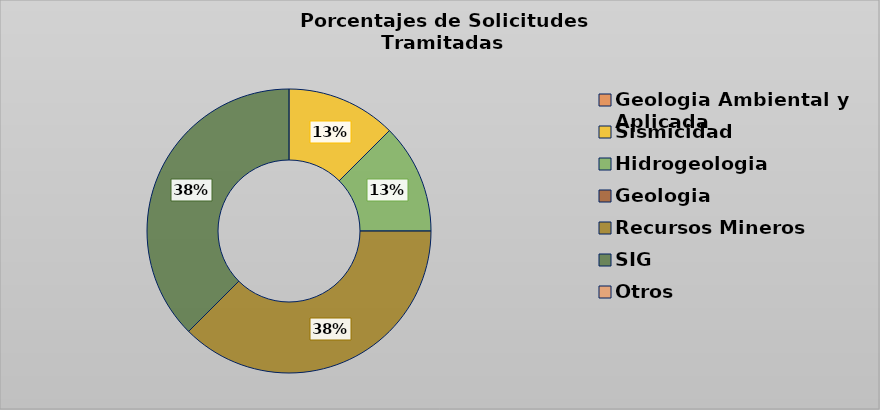
| Category | Series 0 |
|---|---|
| Geologia Ambiental y Aplicada | 0 |
| Sismicidad | 12.5 |
| Hidrogeologia | 12.5 |
| Geologia | 0 |
| Recursos Mineros | 37.5 |
| SIG | 37.5 |
| Otros | 0 |